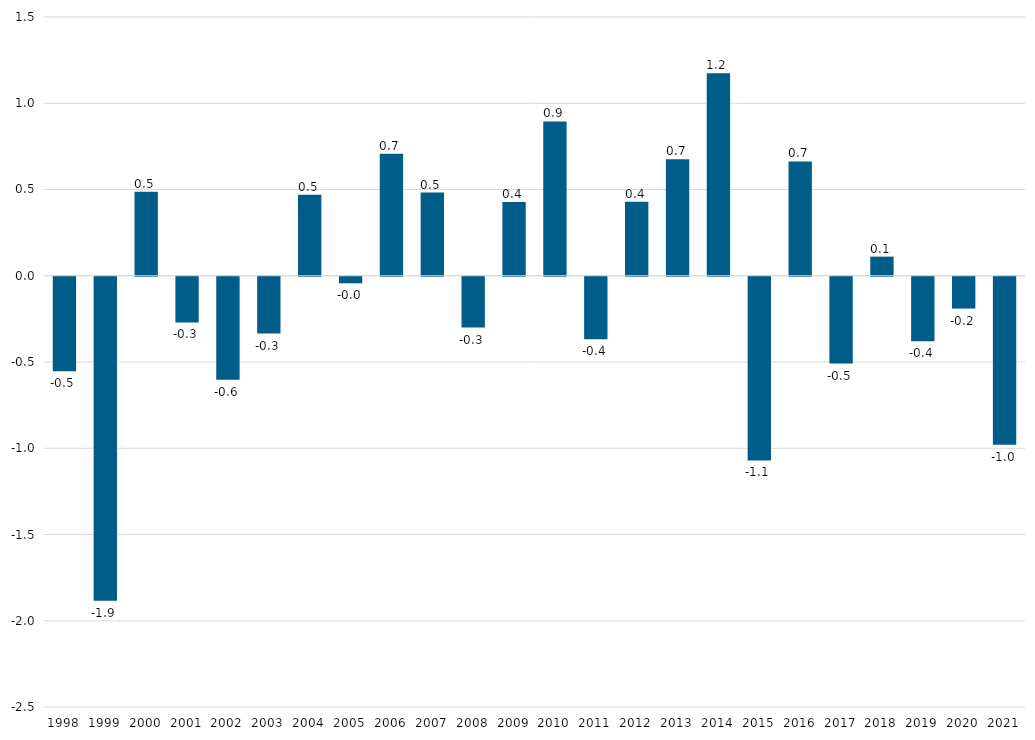
| Category | Impulso Fiscal |
|---|---|
| 1998.0 | -0.547 |
| 1999.0 | -1.879 |
| 2000.0 | 0.487 |
| 2001.0 | -0.265 |
| 2002.0 | -0.597 |
| 2003.0 | -0.329 |
| 2004.0 | 0.47 |
| 2005.0 | -0.038 |
| 2006.0 | 0.708 |
| 2007.0 | 0.482 |
| 2008.0 | -0.295 |
| 2009.0 | 0.428 |
| 2010.0 | 0.895 |
| 2011.0 | -0.363 |
| 2012.0 | 0.43 |
| 2013.0 | 0.675 |
| 2014.0 | 1.174 |
| 2015.0 | -1.065 |
| 2016.0 | 0.663 |
| 2017.0 | -0.504 |
| 2018.0 | 0.111 |
| 2019.0 | -0.374 |
| 2020.0 | -0.185 |
| 2021.0 | -0.974 |